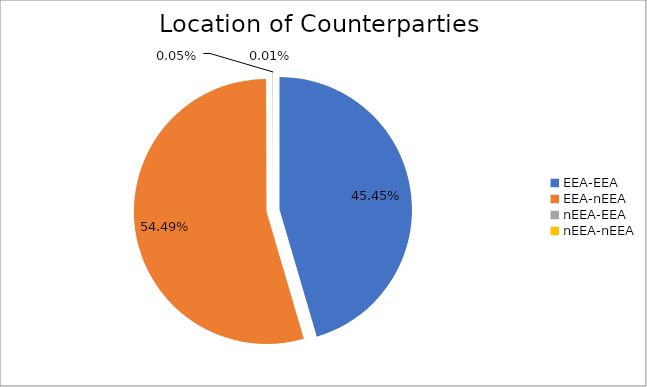
| Category | Series 0 |
|---|---|
| EEA-EEA | 6115350.643 |
| EEA-nEEA | 7330847.296 |
| nEEA-EEA | 6537.256 |
| nEEA-nEEA | 1414.266 |